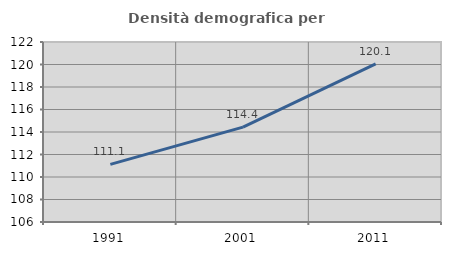
| Category | Densità demografica |
|---|---|
| 1991.0 | 111.127 |
| 2001.0 | 114.438 |
| 2011.0 | 120.06 |